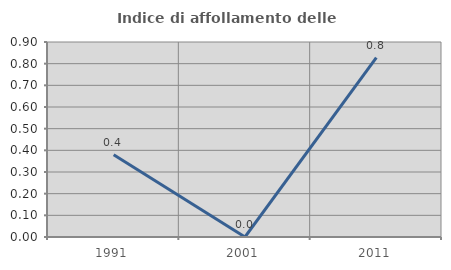
| Category | Indice di affollamento delle abitazioni  |
|---|---|
| 1991.0 | 0.38 |
| 2001.0 | 0 |
| 2011.0 | 0.828 |